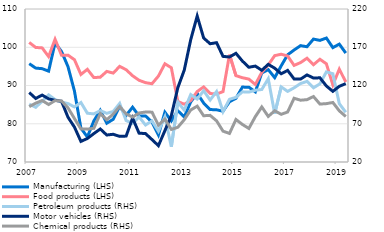
| Category | Manufacturing (LHS) | Food products (LHS) |
|---|---|---|
| 2007 | 95.7 | 101.256 |
| II | 94.557 | 99.947 |
| III | 94.397 | 99.832 |
| IV | 93.75 | 97.567 |
| 2008 | 101.114 | 102.082 |
| II | 98.886 | 97.918 |
| III | 94.936 | 97.94 |
| IV | 88.543 | 96.738 |
| 2009 | 78.855 | 92.888 |
| II | 76.546 | 94.227 |
| III | 80.733 | 92.069 |
| IV | 83.517 | 92.174 |
| 2010 | 80.138 | 93.684 |
| II | 81.159 | 93.25 |
| III | 84.526 | 95.007 |
| IV | 82.197 | 94.124 |
| 2011 | 84.33 | 92.55 |
| II | 82.035 | 91.361 |
| III | 82.047 | 90.746 |
| IV | 80.46 | 90.461 |
| 2012 | 77.088 | 92.462 |
| II | 83.018 | 95.684 |
| III | 80.739 | 94.635 |
| IV | 83.405 | 85.832 |
| 2013 | 81.793 | 85.107 |
| II | 85.721 | 86.046 |
| III | 87.953 | 88.422 |
| IV | 85.407 | 89.622 |
| 2014 | 83.717 | 87.914 |
| II | 83.644 | 87.76 |
| III | 83.28 | 88.41 |
| IV | 85.765 | 98.069 |
| 2015 | 86.647 | 92.573 |
| II | 89.58 | 92.032 |
| III | 89.56 | 91.674 |
| IV | 88.339 | 90.265 |
| 2016 | 93.289 | 93.441 |
| II | 94.148 | 95.366 |
| III | 92.054 | 97.808 |
| IV | 95.126 | 98.175 |
| 2017 | 98.032 | 97.717 |
| II | 99.276 | 95.255 |
| III | 100.419 | 95.991 |
| IV | 100.137 | 97.137 |
| 2018 | 102.136 | 95.441 |
| II | 101.797 | 96.855 |
| III | 102.407 | 95.669 |
| IV | 99.902 | 90.148 |
| 2019 | 100.816 | 94.279 |
| II | 98.481 | 90.916 |